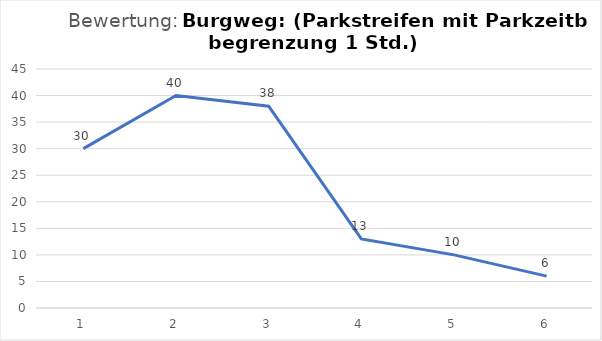
| Category | Series 0 |
|---|---|
| 1.0 | 30 |
| 2.0 | 40 |
| 3.0 | 38 |
| 4.0 | 13 |
| 5.0 | 10 |
| 6.0 | 6 |